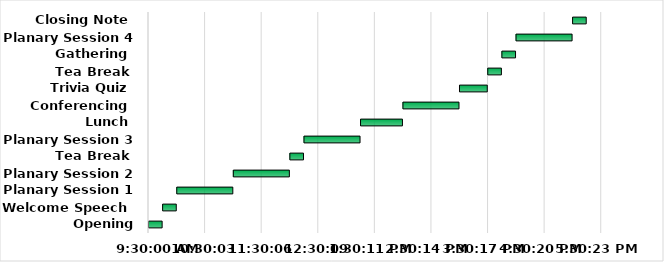
| Category | Starting Time | Minutes |
|---|---|---|
| Opening Ceromony | 0.396 | 0.01 |
| Welcome Speech | 0.406 | 0.01 |
| Planary Session 1 | 0.417 | 0.042 |
| Planary Session 2 | 0.458 | 0.042 |
| Tea Break | 0.5 | 0.01 |
| Planary Session 3 | 0.51 | 0.042 |
| Lunch | 0.552 | 0.031 |
| Conferencing | 0.583 | 0.042 |
| Trivia Quiz | 0.625 | 0.021 |
| Tea Break | 0.646 | 0.01 |
| Gathering | 0.656 | 0.01 |
| Planary Session 4 | 0.667 | 0.042 |
| Closing Note | 0.708 | 0.01 |